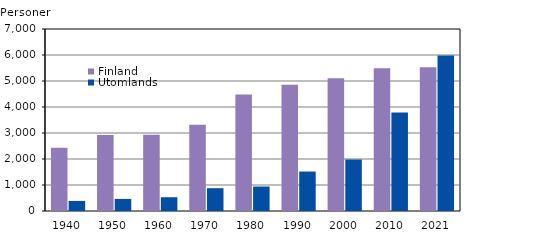
| Category | Finland  | Utomlands |
|---|---|---|
| 1940.0 | 2428 | 387 |
| 1950.0 | 2926 | 464 |
| 1960.0 | 2930 | 530 |
| 1970.0 | 3316 | 877 |
| 1980.0 | 4477 | 942 |
| 1990.0 | 4857 | 1518 |
| 2000.0 | 5109 | 1985 |
| 2010.0 | 5490 | 3785 |
| 2021.0 | 5529 | 5977 |